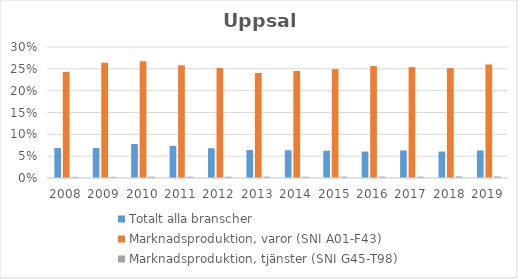
| Category | Totalt alla branscher | Marknadsproduktion, varor (SNI A01-F43) | Marknadsproduktion, tjänster (SNI G45-T98) |
|---|---|---|---|
| 2008 | 0.069 | 0.243 | 0.003 |
| 2009 | 0.069 | 0.264 | 0.003 |
| 2010 | 0.078 | 0.267 | 0.003 |
| 2011 | 0.074 | 0.258 | 0.003 |
| 2012 | 0.068 | 0.252 | 0.003 |
| 2013 | 0.064 | 0.24 | 0.003 |
| 2014 | 0.063 | 0.245 | 0.003 |
| 2015 | 0.063 | 0.249 | 0.003 |
| 2016 | 0.06 | 0.256 | 0.003 |
| 2017 | 0.063 | 0.254 | 0.003 |
| 2018 | 0.061 | 0.252 | 0.004 |
| 2019 | 0.063 | 0.26 | 0.004 |